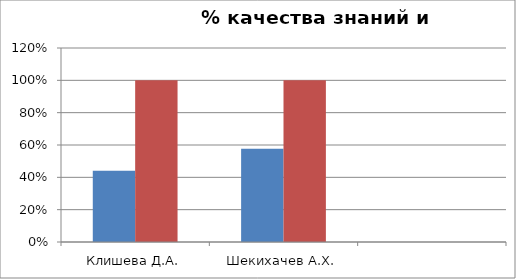
| Category | Series 0 | 2 |
|---|---|---|
| Клишева Д.А. | 0.44 | 1 |
| Шекихачев А.Х. | 0.577 | 1 |